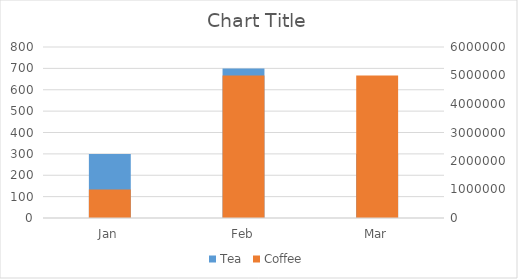
| Category | Tea |
|---|---|
| Jan | 300 |
| Feb | 700 |
| Mar | 300 |